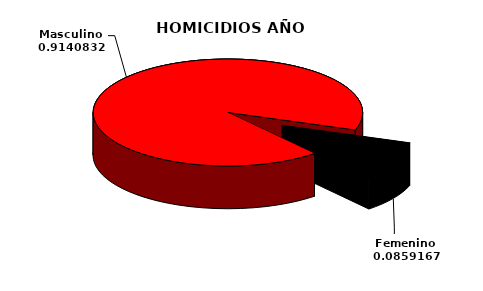
| Category | 2012 |
|---|---|
| Masculino | 2064 |
| Femenino | 194 |